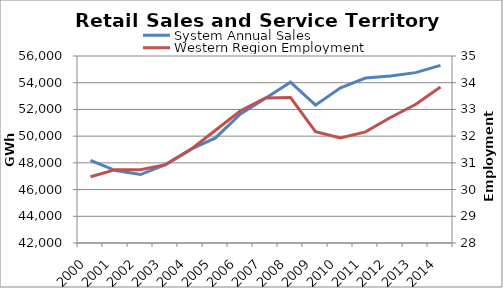
| Category | System Annual Sales |
|---|---|
| 2000.0 | 48177.832 |
| 2001.0 | 47420.756 |
| 2002.0 | 47126.742 |
| 2003.0 | 47868.327 |
| 2004.0 | 49009.38 |
| 2005.0 | 49868.039 |
| 2006.0 | 51663.322 |
| 2007.0 | 52840.381 |
| 2008.0 | 54038.613 |
| 2009.0 | 52323.061 |
| 2010.0 | 53620.876 |
| 2011.0 | 54350.489 |
| 2012.0 | 54509.618 |
| 2013.0 | 54754.253 |
| 2014.0 | 55297.059 |